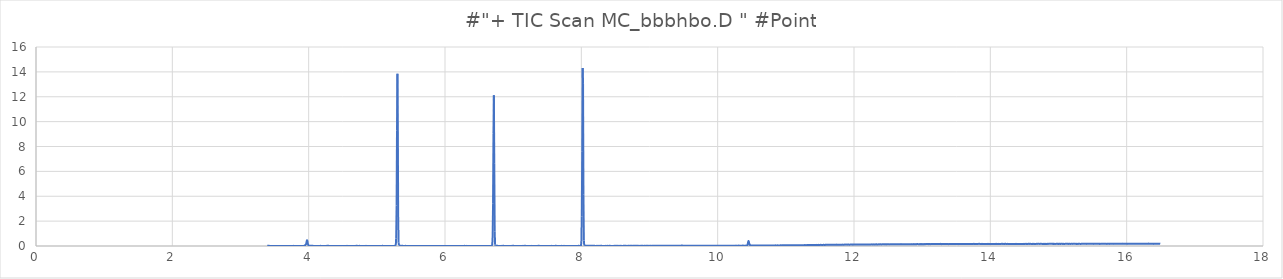
| Category | Series 0 |
|---|---|
| 3.393 | 0.01 |
| 3.399 | 0.013 |
| 3.405 | 0.017 |
| 3.411 | 0.016 |
| 3.417 | 0.013 |
| 3.423 | 0.011 |
| 3.429 | 0.007 |
| 3.435 | 0.007 |
| 3.44 | 0.005 |
| 3.446 | 0.007 |
| 3.452 | 0.005 |
| 3.458 | 0.008 |
| 3.464 | 0.009 |
| 3.47 | 0.007 |
| 3.476 | 0.004 |
| 3.482 | 0.007 |
| 3.488 | 0.006 |
| 3.494 | 0.006 |
| 3.5 | 0.009 |
| 3.506 | 0.006 |
| 3.512 | 0.004 |
| 3.518 | 0.008 |
| 3.524 | 0.006 |
| 3.53 | 0.006 |
| 3.536 | 0.005 |
| 3.542 | 0.007 |
| 3.547 | 0.008 |
| 3.553 | 0.005 |
| 3.559 | 0.005 |
| 3.565 | 0.008 |
| 3.571 | 0.008 |
| 3.577 | 0.007 |
| 3.583 | 0.008 |
| 3.589 | 0.005 |
| 3.595 | 0.003 |
| 3.601 | 0.006 |
| 3.607 | 0.007 |
| 3.613 | 0.004 |
| 3.619 | 0.006 |
| 3.625 | 0.004 |
| 3.631 | 0.007 |
| 3.637 | 0.007 |
| 3.643 | 0.005 |
| 3.649 | 0.003 |
| 3.655 | 0.005 |
| 3.66 | 0.006 |
| 3.666 | 0.01 |
| 3.672 | 0.007 |
| 3.678 | 0.007 |
| 3.684 | 0.005 |
| 3.69 | 0.008 |
| 3.696 | 0.007 |
| 3.702 | 0.007 |
| 3.708 | 0.005 |
| 3.714 | 0.009 |
| 3.72 | 0.004 |
| 3.726 | 0.006 |
| 3.732 | 0.003 |
| 3.738 | 0.006 |
| 3.744 | 0.006 |
| 3.75 | 0.005 |
| 3.756 | 0.004 |
| 3.762 | 0.008 |
| 3.767 | 0.005 |
| 3.773 | 0.007 |
| 3.779 | 0.011 |
| 3.785 | 0.006 |
| 3.791 | 0.008 |
| 3.797 | 0.008 |
| 3.803 | 0.005 |
| 3.809 | 0.004 |
| 3.815 | 0.003 |
| 3.821 | 0.002 |
| 3.827 | 0.003 |
| 3.833 | 0.001 |
| 3.839 | 0.005 |
| 3.845 | 0.005 |
| 3.851 | 0.008 |
| 3.857 | 0.003 |
| 3.863 | 0.006 |
| 3.869 | 0.004 |
| 3.875 | 0.006 |
| 3.88 | 0.007 |
| 3.886 | 0.003 |
| 3.892 | 0.004 |
| 3.898 | 0.004 |
| 3.904 | 0.006 |
| 3.91 | 0.004 |
| 3.916 | 0.003 |
| 3.922 | 0.003 |
| 3.928 | 0.009 |
| 3.934 | 0.012 |
| 3.94 | 0.023 |
| 3.946 | 0.049 |
| 3.952 | 0.09 |
| 3.958 | 0.119 |
| 3.964 | 0.189 |
| 3.97 | 0.36 |
| 3.976 | 0.465 |
| 3.982 | 0.378 |
| 3.987 | 0.197 |
| 3.993 | 0.092 |
| 3.999 | 0.049 |
| 4.005 | 0.027 |
| 4.011 | 0.023 |
| 4.017 | 0.019 |
| 4.023 | 0.017 |
| 4.029 | 0.014 |
| 4.035 | 0.016 |
| 4.041 | 0.019 |
| 4.047 | 0.025 |
| 4.053 | 0.024 |
| 4.059 | 0.019 |
| 4.065 | 0.012 |
| 4.071 | 0.008 |
| 4.077 | 0.008 |
| 4.083 | 0.008 |
| 4.089 | 0.009 |
| 4.095 | 0.007 |
| 4.1 | 0.008 |
| 4.106 | 0.008 |
| 4.112 | 0.008 |
| 4.118 | 0.009 |
| 4.124 | 0.005 |
| 4.13 | 0.009 |
| 4.136 | 0.008 |
| 4.142 | 0.008 |
| 4.148 | 0.008 |
| 4.154 | 0.004 |
| 4.16 | 0.003 |
| 4.166 | 0.01 |
| 4.172 | 0.012 |
| 4.178 | 0.009 |
| 4.184 | 0.007 |
| 4.19 | 0.006 |
| 4.196 | 0.003 |
| 4.202 | 0.002 |
| 4.207 | 0.007 |
| 4.213 | 0.004 |
| 4.219 | 0.003 |
| 4.225 | 0.004 |
| 4.231 | 0.006 |
| 4.237 | 0.004 |
| 4.243 | 0.004 |
| 4.249 | 0.008 |
| 4.255 | 0.008 |
| 4.261 | 0.008 |
| 4.267 | 0.018 |
| 4.273 | 0.027 |
| 4.279 | 0.023 |
| 4.285 | 0.016 |
| 4.291 | 0.014 |
| 4.297 | 0.009 |
| 4.303 | 0.005 |
| 4.309 | 0.006 |
| 4.315 | 0.004 |
| 4.32 | 0.007 |
| 4.326 | 0.005 |
| 4.332 | 0.006 |
| 4.338 | 0.007 |
| 4.344 | 0.005 |
| 4.35 | 0.005 |
| 4.356 | 0.003 |
| 4.362 | 0.007 |
| 4.368 | 0.006 |
| 4.374 | 0.007 |
| 4.38 | 0.004 |
| 4.386 | 0.006 |
| 4.392 | 0.007 |
| 4.398 | 0.005 |
| 4.404 | 0.006 |
| 4.41 | 0.005 |
| 4.416 | 0.006 |
| 4.422 | 0.006 |
| 4.428 | 0.005 |
| 4.433 | 0.005 |
| 4.439 | 0.006 |
| 4.445 | 0.006 |
| 4.451 | 0.003 |
| 4.457 | 0.004 |
| 4.463 | 0.004 |
| 4.469 | 0.008 |
| 4.475 | 0.006 |
| 4.481 | 0.004 |
| 4.487 | 0.006 |
| 4.493 | 0.006 |
| 4.499 | 0.002 |
| 4.505 | 0.007 |
| 4.511 | 0.005 |
| 4.517 | 0.005 |
| 4.523 | 0.005 |
| 4.529 | 0.005 |
| 4.535 | 0.003 |
| 4.54 | 0.008 |
| 4.546 | 0.005 |
| 4.552 | 0.004 |
| 4.558 | 0.009 |
| 4.564 | 0.012 |
| 4.57 | 0.007 |
| 4.576 | 0.008 |
| 4.582 | 0.006 |
| 4.588 | 0.007 |
| 4.594 | 0.004 |
| 4.6 | 0.004 |
| 4.606 | 0.004 |
| 4.612 | 0.007 |
| 4.618 | 0.008 |
| 4.624 | 0.006 |
| 4.63 | 0.007 |
| 4.636 | 0.005 |
| 4.642 | 0.004 |
| 4.648 | 0.002 |
| 4.653 | 0.005 |
| 4.659 | 0.007 |
| 4.665 | 0.004 |
| 4.671 | 0.006 |
| 4.677 | 0.006 |
| 4.683 | 0.008 |
| 4.689 | 0.009 |
| 4.695 | 0.012 |
| 4.701 | 0.017 |
| 4.707 | 0.017 |
| 4.713 | 0.01 |
| 4.719 | 0.007 |
| 4.725 | 0.007 |
| 4.731 | 0.003 |
| 4.737 | 0.006 |
| 4.743 | 0.01 |
| 4.749 | 0.012 |
| 4.755 | 0.005 |
| 4.76 | 0.004 |
| 4.766 | 0.005 |
| 4.772 | 0.006 |
| 4.778 | 0.005 |
| 4.784 | 0.007 |
| 4.79 | 0.003 |
| 4.796 | 0.002 |
| 4.802 | 0.006 |
| 4.808 | 0.004 |
| 4.814 | 0.003 |
| 4.82 | 0.003 |
| 4.826 | 0.006 |
| 4.832 | 0.008 |
| 4.838 | 0.01 |
| 4.844 | 0.01 |
| 4.85 | 0.008 |
| 4.856 | 0.005 |
| 4.862 | 0.003 |
| 4.868 | 0.005 |
| 4.873 | 0.006 |
| 4.879 | 0.004 |
| 4.885 | 0.004 |
| 4.891 | 0.005 |
| 4.897 | 0.003 |
| 4.903 | 0.002 |
| 4.909 | 0.004 |
| 4.915 | 0.004 |
| 4.921 | 0 |
| 4.927 | 0.001 |
| 4.933 | 0.001 |
| 4.939 | 0.005 |
| 4.945 | 0.003 |
| 4.951 | 0.001 |
| 4.957 | 0.003 |
| 4.963 | 0.002 |
| 4.969 | 0.006 |
| 4.975 | 0.003 |
| 4.98 | 0.003 |
| 4.986 | 0.003 |
| 4.992 | 0.001 |
| 4.998 | 0 |
| 5.004 | 0.005 |
| 5.01 | 0.003 |
| 5.016 | 0.003 |
| 5.022 | 0.002 |
| 5.028 | 0.005 |
| 5.034 | 0.003 |
| 5.04 | 0.005 |
| 5.046 | 0.003 |
| 5.052 | 0.005 |
| 5.058 | 0.005 |
| 5.064 | 0.003 |
| 5.07 | 0.008 |
| 5.076 | 0.008 |
| 5.082 | 0.013 |
| 5.088 | 0.011 |
| 5.093 | 0.007 |
| 5.099 | 0.007 |
| 5.105 | 0.007 |
| 5.111 | 0.004 |
| 5.117 | 0.004 |
| 5.123 | 0.003 |
| 5.129 | 0.004 |
| 5.135 | 0.001 |
| 5.141 | 0.004 |
| 5.147 | 0.007 |
| 5.153 | 0.006 |
| 5.159 | 0.007 |
| 5.165 | 0.006 |
| 5.171 | 0.005 |
| 5.177 | 0.002 |
| 5.183 | 0.003 |
| 5.189 | 0.004 |
| 5.195 | 0.003 |
| 5.2 | 0.004 |
| 5.206 | 0.004 |
| 5.212 | 0.001 |
| 5.218 | 0.004 |
| 5.224 | 0.001 |
| 5.23 | 0.002 |
| 5.236 | 0.005 |
| 5.242 | 0.002 |
| 5.248 | 0.002 |
| 5.254 | 0.009 |
| 5.26 | 0.01 |
| 5.266 | 0.015 |
| 5.272 | 0.015 |
| 5.278 | 0.067 |
| 5.284 | 0.626 |
| 5.29 | 3.249 |
| 5.296 | 9.279 |
| 5.302 | 13.857 |
| 5.308 | 9.573 |
| 5.313 | 2.323 |
| 5.319 | 0.265 |
| 5.325 | 0.062 |
| 5.331 | 0.037 |
| 5.337 | 0.029 |
| 5.343 | 0.02 |
| 5.349 | 0.019 |
| 5.355 | 0.018 |
| 5.361 | 0.014 |
| 5.367 | 0.009 |
| 5.373 | 0.013 |
| 5.379 | 0.014 |
| 5.385 | 0.007 |
| 5.391 | 0.009 |
| 5.397 | 0.005 |
| 5.403 | 0.009 |
| 5.409 | 0.008 |
| 5.415 | 0.01 |
| 5.42 | 0.011 |
| 5.426 | 0.008 |
| 5.432 | 0.009 |
| 5.438 | 0.009 |
| 5.444 | 0.008 |
| 5.45 | 0.004 |
| 5.456 | 0.005 |
| 5.462 | 0.008 |
| 5.468 | 0.006 |
| 5.474 | 0.006 |
| 5.48 | 0.004 |
| 5.486 | 0.007 |
| 5.492 | 0.005 |
| 5.498 | 0.006 |
| 5.504 | 0.006 |
| 5.51 | 0.006 |
| 5.516 | 0.003 |
| 5.522 | 0.005 |
| 5.528 | 0.003 |
| 5.533 | 0.003 |
| 5.539 | 0.004 |
| 5.545 | 0.005 |
| 5.551 | 0.005 |
| 5.557 | 0.003 |
| 5.563 | 0.003 |
| 5.569 | 0.005 |
| 5.575 | 0.003 |
| 5.581 | 0.004 |
| 5.587 | 0.003 |
| 5.593 | 0.004 |
| 5.599 | 0.002 |
| 5.605 | 0.005 |
| 5.611 | 0.007 |
| 5.617 | 0.006 |
| 5.623 | 0.003 |
| 5.629 | 0.006 |
| 5.635 | 0.006 |
| 5.64 | 0.004 |
| 5.646 | 0.006 |
| 5.652 | 0.002 |
| 5.658 | 0.004 |
| 5.664 | 0.001 |
| 5.67 | 0.006 |
| 5.676 | 0.003 |
| 5.682 | 0.004 |
| 5.688 | 0.002 |
| 5.694 | 0.004 |
| 5.7 | 0.002 |
| 5.706 | 0.002 |
| 5.712 | 0.004 |
| 5.718 | 0.006 |
| 5.724 | 0.003 |
| 5.73 | 0.003 |
| 5.736 | 0.003 |
| 5.742 | 0.002 |
| 5.748 | 0.001 |
| 5.753 | 0.005 |
| 5.759 | 0.004 |
| 5.765 | 0.005 |
| 5.771 | 0.002 |
| 5.777 | 0.001 |
| 5.783 | 0.003 |
| 5.789 | 0.007 |
| 5.795 | 0.002 |
| 5.801 | 0.006 |
| 5.807 | 0 |
| 5.813 | 0.003 |
| 5.819 | 0.003 |
| 5.825 | 0.002 |
| 5.831 | 0.004 |
| 5.837 | 0.005 |
| 5.843 | 0.004 |
| 5.849 | 0.003 |
| 5.855 | 0.001 |
| 5.86 | 0.003 |
| 5.866 | 0.003 |
| 5.872 | 0.004 |
| 5.878 | 0.005 |
| 5.884 | 0.002 |
| 5.89 | 0.004 |
| 5.896 | 0 |
| 5.902 | 0.004 |
| 5.908 | 0.005 |
| 5.914 | 0.002 |
| 5.92 | 0.005 |
| 5.926 | 0.005 |
| 5.932 | 0.004 |
| 5.938 | 0.004 |
| 5.944 | 0.005 |
| 5.95 | 0.005 |
| 5.956 | 0.002 |
| 5.962 | 0.008 |
| 5.968 | 0.004 |
| 5.973 | 0.006 |
| 5.979 | 0.003 |
| 5.985 | 0.005 |
| 5.991 | 0.005 |
| 5.997 | 0.005 |
| 6.003 | 0.006 |
| 6.009 | 0.006 |
| 6.015 | 0.004 |
| 6.021 | 0.007 |
| 6.027 | 0.006 |
| 6.033 | 0.006 |
| 6.039 | 0.004 |
| 6.045 | 0.005 |
| 6.051 | 0.004 |
| 6.057 | 0.009 |
| 6.063 | 0.008 |
| 6.069 | 0.008 |
| 6.075 | 0.004 |
| 6.08 | 0.003 |
| 6.086 | 0.007 |
| 6.092 | 0.006 |
| 6.098 | 0.005 |
| 6.104 | 0.002 |
| 6.11 | 0.002 |
| 6.116 | 0.002 |
| 6.122 | 0.004 |
| 6.128 | 0.003 |
| 6.134 | 0.003 |
| 6.14 | 0.002 |
| 6.146 | 0.003 |
| 6.152 | 0.003 |
| 6.158 | 0.005 |
| 6.164 | 0.005 |
| 6.17 | 0.005 |
| 6.176 | 0 |
| 6.182 | 0.004 |
| 6.188 | 0.004 |
| 6.193 | 0.005 |
| 6.199 | 0.001 |
| 6.205 | 0.001 |
| 6.211 | 0.003 |
| 6.217 | 0.002 |
| 6.223 | 0.004 |
| 6.229 | 0.005 |
| 6.235 | 0.005 |
| 6.241 | 0.004 |
| 6.247 | 0.006 |
| 6.253 | 0.005 |
| 6.259 | 0.004 |
| 6.265 | 0.004 |
| 6.271 | 0.003 |
| 6.277 | 0.007 |
| 6.283 | 0.011 |
| 6.289 | 0.011 |
| 6.295 | 0.006 |
| 6.3 | 0.003 |
| 6.306 | 0.004 |
| 6.312 | 0.004 |
| 6.318 | 0.01 |
| 6.324 | 0.005 |
| 6.33 | 0.006 |
| 6.336 | 0.002 |
| 6.342 | 0.003 |
| 6.348 | 0.002 |
| 6.354 | 0.007 |
| 6.36 | 0.005 |
| 6.366 | 0.002 |
| 6.372 | 0.002 |
| 6.378 | 0.004 |
| 6.384 | 0.002 |
| 6.39 | 0.002 |
| 6.396 | 0.002 |
| 6.402 | 0.006 |
| 6.408 | 0.003 |
| 6.413 | 0.004 |
| 6.419 | 0.006 |
| 6.425 | 0.004 |
| 6.431 | 0.006 |
| 6.437 | 0.006 |
| 6.443 | 0.005 |
| 6.449 | 0.003 |
| 6.455 | 0.004 |
| 6.461 | 0.003 |
| 6.467 | 0.002 |
| 6.473 | 0.001 |
| 6.479 | 0.004 |
| 6.485 | 0.005 |
| 6.491 | 0.004 |
| 6.497 | 0 |
| 6.503 | 0.002 |
| 6.509 | 0.004 |
| 6.515 | 0.005 |
| 6.52 | 0.001 |
| 6.526 | 0.004 |
| 6.532 | 0.004 |
| 6.538 | 0.005 |
| 6.544 | 0.003 |
| 6.55 | 0.006 |
| 6.556 | 0.004 |
| 6.562 | 0.005 |
| 6.568 | 0.002 |
| 6.574 | 0.005 |
| 6.58 | 0.002 |
| 6.586 | 0.003 |
| 6.592 | 0.003 |
| 6.598 | 0.005 |
| 6.604 | 0.007 |
| 6.61 | 0.004 |
| 6.616 | 0.003 |
| 6.622 | 0.005 |
| 6.628 | 0.008 |
| 6.633 | 0.005 |
| 6.639 | 0.004 |
| 6.645 | 0.004 |
| 6.651 | 0.005 |
| 6.657 | 0.004 |
| 6.663 | 0.005 |
| 6.669 | 0.002 |
| 6.675 | 0.004 |
| 6.681 | 0.005 |
| 6.687 | 0.008 |
| 6.693 | 0.078 |
| 6.699 | 0.721 |
| 6.705 | 3.446 |
| 6.711 | 9.075 |
| 6.717 | 12.122 |
| 6.723 | 6.611 |
| 6.729 | 1.139 |
| 6.735 | 0.112 |
| 6.74 | 0.029 |
| 6.746 | 0.021 |
| 6.752 | 0.017 |
| 6.758 | 0.01 |
| 6.764 | 0.014 |
| 6.77 | 0.012 |
| 6.776 | 0.01 |
| 6.782 | 0.008 |
| 6.788 | 0.008 |
| 6.794 | 0.008 |
| 6.8 | 0.006 |
| 6.806 | 0.005 |
| 6.812 | 0.007 |
| 6.818 | 0.005 |
| 6.824 | 0.006 |
| 6.83 | 0.006 |
| 6.836 | 0.011 |
| 6.842 | 0.007 |
| 6.848 | 0.01 |
| 6.853 | 0.011 |
| 6.859 | 0.012 |
| 6.865 | 0.008 |
| 6.871 | 0.007 |
| 6.877 | 0.004 |
| 6.883 | 0.005 |
| 6.889 | 0.009 |
| 6.895 | 0.007 |
| 6.901 | 0.003 |
| 6.907 | 0.005 |
| 6.913 | 0.006 |
| 6.919 | 0.005 |
| 6.925 | 0.007 |
| 6.931 | 0.007 |
| 6.937 | 0.007 |
| 6.943 | 0.004 |
| 6.949 | 0.001 |
| 6.955 | 0.006 |
| 6.96 | 0.005 |
| 6.966 | 0.005 |
| 6.972 | 0.006 |
| 6.978 | 0.007 |
| 6.984 | 0.011 |
| 6.99 | 0.007 |
| 6.996 | 0.012 |
| 7.002 | 0.014 |
| 7.008 | 0.013 |
| 7.014 | 0.009 |
| 7.02 | 0.007 |
| 7.026 | 0.008 |
| 7.032 | 0.007 |
| 7.038 | 0.006 |
| 7.044 | 0.005 |
| 7.05 | 0.006 |
| 7.056 | 0.005 |
| 7.062 | 0.007 |
| 7.068 | 0.005 |
| 7.073 | 0.006 |
| 7.079 | 0.005 |
| 7.085 | 0.004 |
| 7.091 | 0.007 |
| 7.097 | 0.005 |
| 7.103 | 0.007 |
| 7.109 | 0.007 |
| 7.115 | 0.007 |
| 7.121 | 0.006 |
| 7.127 | 0.005 |
| 7.133 | 0.006 |
| 7.139 | 0.01 |
| 7.145 | 0.007 |
| 7.151 | 0.004 |
| 7.157 | 0.01 |
| 7.163 | 0.009 |
| 7.169 | 0.018 |
| 7.175 | 0.016 |
| 7.18 | 0.012 |
| 7.186 | 0.008 |
| 7.192 | 0.008 |
| 7.198 | 0.007 |
| 7.204 | 0.007 |
| 7.21 | 0.009 |
| 7.216 | 0.008 |
| 7.222 | 0.008 |
| 7.228 | 0.006 |
| 7.234 | 0.007 |
| 7.24 | 0.006 |
| 7.246 | 0.008 |
| 7.252 | 0.007 |
| 7.258 | 0.009 |
| 7.264 | 0.007 |
| 7.27 | 0.007 |
| 7.276 | 0.011 |
| 7.282 | 0.006 |
| 7.288 | 0.003 |
| 7.293 | 0.007 |
| 7.299 | 0.005 |
| 7.305 | 0.002 |
| 7.311 | 0.006 |
| 7.317 | 0.007 |
| 7.323 | 0.006 |
| 7.329 | 0.007 |
| 7.335 | 0.003 |
| 7.341 | 0.006 |
| 7.347 | 0.003 |
| 7.353 | 0.006 |
| 7.359 | 0.006 |
| 7.365 | 0.013 |
| 7.371 | 0.014 |
| 7.377 | 0.014 |
| 7.383 | 0.012 |
| 7.389 | 0.007 |
| 7.395 | 0.008 |
| 7.4 | 0.005 |
| 7.406 | 0.008 |
| 7.412 | 0.008 |
| 7.418 | 0.008 |
| 7.424 | 0.007 |
| 7.43 | 0.008 |
| 7.436 | 0.009 |
| 7.442 | 0.009 |
| 7.448 | 0.01 |
| 7.454 | 0.007 |
| 7.46 | 0.007 |
| 7.466 | 0.007 |
| 7.472 | 0.007 |
| 7.478 | 0.005 |
| 7.484 | 0.007 |
| 7.49 | 0.007 |
| 7.496 | 0.01 |
| 7.502 | 0.008 |
| 7.508 | 0.008 |
| 7.513 | 0.008 |
| 7.519 | 0.008 |
| 7.525 | 0.007 |
| 7.531 | 0.005 |
| 7.537 | 0.006 |
| 7.543 | 0.006 |
| 7.549 | 0.009 |
| 7.555 | 0.008 |
| 7.561 | 0.011 |
| 7.567 | 0.01 |
| 7.573 | 0.008 |
| 7.579 | 0.004 |
| 7.585 | 0.009 |
| 7.591 | 0.006 |
| 7.597 | 0.009 |
| 7.603 | 0.008 |
| 7.609 | 0.008 |
| 7.615 | 0.009 |
| 7.62 | 0.012 |
| 7.626 | 0.018 |
| 7.632 | 0.014 |
| 7.638 | 0.008 |
| 7.644 | 0.007 |
| 7.65 | 0.005 |
| 7.656 | 0.008 |
| 7.662 | 0.007 |
| 7.668 | 0.005 |
| 7.674 | 0.005 |
| 7.68 | 0.007 |
| 7.686 | 0.008 |
| 7.692 | 0.009 |
| 7.698 | 0.009 |
| 7.704 | 0.005 |
| 7.71 | 0.011 |
| 7.716 | 0.005 |
| 7.722 | 0.008 |
| 7.728 | 0.005 |
| 7.733 | 0.006 |
| 7.739 | 0.008 |
| 7.745 | 0.011 |
| 7.751 | 0.008 |
| 7.757 | 0.008 |
| 7.763 | 0.006 |
| 7.769 | 0.009 |
| 7.775 | 0.004 |
| 7.781 | 0.004 |
| 7.787 | 0.006 |
| 7.793 | 0.005 |
| 7.799 | 0.005 |
| 7.805 | 0.008 |
| 7.811 | 0.005 |
| 7.817 | 0.009 |
| 7.823 | 0.005 |
| 7.829 | 0.002 |
| 7.835 | 0.005 |
| 7.84 | 0.007 |
| 7.846 | 0.007 |
| 7.852 | 0.007 |
| 7.858 | 0.007 |
| 7.864 | 0.006 |
| 7.87 | 0.005 |
| 7.876 | 0.006 |
| 7.882 | 0.003 |
| 7.888 | 0.01 |
| 7.894 | 0.008 |
| 7.9 | 0.009 |
| 7.906 | 0.009 |
| 7.912 | 0.008 |
| 7.918 | 0.007 |
| 7.924 | 0.009 |
| 7.93 | 0.008 |
| 7.936 | 0.006 |
| 7.942 | 0.009 |
| 7.948 | 0.009 |
| 7.953 | 0.01 |
| 7.959 | 0.014 |
| 7.965 | 0.011 |
| 7.971 | 0.008 |
| 7.977 | 0.005 |
| 7.983 | 0.008 |
| 7.989 | 0.006 |
| 7.995 | 0.047 |
| 8.001 | 0.391 |
| 8.007 | 2.365 |
| 8.013 | 7.599 |
| 8.019 | 14.319 |
| 8.025 | 13.042 |
| 8.031 | 4.167 |
| 8.037 | 0.439 |
| 8.043 | 0.053 |
| 8.049 | 0.027 |
| 8.055 | 0.025 |
| 8.06 | 0.02 |
| 8.066 | 0.014 |
| 8.072 | 0.016 |
| 8.078 | 0.016 |
| 8.084 | 0.017 |
| 8.09 | 0.012 |
| 8.096 | 0.016 |
| 8.102 | 0.016 |
| 8.108 | 0.014 |
| 8.114 | 0.012 |
| 8.12 | 0.012 |
| 8.126 | 0.013 |
| 8.132 | 0.012 |
| 8.138 | 0.009 |
| 8.144 | 0.015 |
| 8.15 | 0.01 |
| 8.156 | 0.012 |
| 8.162 | 0.011 |
| 8.168 | 0.013 |
| 8.173 | 0.019 |
| 8.179 | 0.015 |
| 8.185 | 0.015 |
| 8.191 | 0.013 |
| 8.197 | 0.012 |
| 8.203 | 0.009 |
| 8.209 | 0.01 |
| 8.215 | 0.009 |
| 8.221 | 0.008 |
| 8.227 | 0.011 |
| 8.233 | 0.01 |
| 8.239 | 0.008 |
| 8.245 | 0.006 |
| 8.251 | 0.009 |
| 8.257 | 0.011 |
| 8.263 | 0.008 |
| 8.269 | 0.011 |
| 8.275 | 0.009 |
| 8.28 | 0.011 |
| 8.286 | 0.013 |
| 8.292 | 0.014 |
| 8.298 | 0.012 |
| 8.304 | 0.009 |
| 8.31 | 0.007 |
| 8.316 | 0.007 |
| 8.322 | 0.006 |
| 8.328 | 0.007 |
| 8.334 | 0.007 |
| 8.34 | 0.009 |
| 8.346 | 0.008 |
| 8.352 | 0.011 |
| 8.358 | 0.007 |
| 8.364 | 0.01 |
| 8.37 | 0.009 |
| 8.376 | 0.012 |
| 8.382 | 0.013 |
| 8.388 | 0.009 |
| 8.393 | 0.009 |
| 8.399 | 0.009 |
| 8.405 | 0.012 |
| 8.411 | 0.013 |
| 8.417 | 0.014 |
| 8.423 | 0.01 |
| 8.429 | 0.01 |
| 8.435 | 0.009 |
| 8.441 | 0.008 |
| 8.447 | 0.009 |
| 8.453 | 0.009 |
| 8.459 | 0.008 |
| 8.465 | 0.008 |
| 8.471 | 0.009 |
| 8.477 | 0.009 |
| 8.483 | 0.013 |
| 8.489 | 0.01 |
| 8.495 | 0.01 |
| 8.5 | 0.012 |
| 8.506 | 0.007 |
| 8.512 | 0.011 |
| 8.518 | 0.007 |
| 8.524 | 0.011 |
| 8.53 | 0.011 |
| 8.536 | 0.007 |
| 8.542 | 0.01 |
| 8.548 | 0.011 |
| 8.554 | 0.008 |
| 8.56 | 0.011 |
| 8.566 | 0.007 |
| 8.572 | 0.013 |
| 8.578 | 0.009 |
| 8.584 | 0.009 |
| 8.59 | 0.01 |
| 8.596 | 0.007 |
| 8.602 | 0.008 |
| 8.608 | 0.008 |
| 8.613 | 0.011 |
| 8.619 | 0.01 |
| 8.625 | 0.014 |
| 8.631 | 0.012 |
| 8.637 | 0.011 |
| 8.643 | 0.012 |
| 8.649 | 0.011 |
| 8.655 | 0.011 |
| 8.661 | 0.007 |
| 8.667 | 0.01 |
| 8.673 | 0.009 |
| 8.679 | 0.01 |
| 8.685 | 0.012 |
| 8.691 | 0.012 |
| 8.697 | 0.011 |
| 8.703 | 0.012 |
| 8.709 | 0.008 |
| 8.715 | 0.012 |
| 8.72 | 0.011 |
| 8.726 | 0.014 |
| 8.732 | 0.01 |
| 8.738 | 0.013 |
| 8.744 | 0.011 |
| 8.75 | 0.009 |
| 8.756 | 0.013 |
| 8.762 | 0.015 |
| 8.768 | 0.011 |
| 8.774 | 0.013 |
| 8.78 | 0.011 |
| 8.786 | 0.013 |
| 8.792 | 0.017 |
| 8.798 | 0.016 |
| 8.804 | 0.016 |
| 8.81 | 0.012 |
| 8.816 | 0.012 |
| 8.822 | 0.012 |
| 8.828 | 0.012 |
| 8.833 | 0.014 |
| 8.839 | 0.01 |
| 8.845 | 0.009 |
| 8.851 | 0.009 |
| 8.857 | 0.011 |
| 8.863 | 0.009 |
| 8.869 | 0.011 |
| 8.875 | 0.013 |
| 8.881 | 0.014 |
| 8.887 | 0.012 |
| 8.893 | 0.017 |
| 8.899 | 0.011 |
| 8.905 | 0.013 |
| 8.911 | 0.009 |
| 8.917 | 0.009 |
| 8.923 | 0.01 |
| 8.929 | 0.012 |
| 8.935 | 0.013 |
| 8.94 | 0.011 |
| 8.946 | 0.009 |
| 8.952 | 0.012 |
| 8.958 | 0.011 |
| 8.964 | 0.01 |
| 8.97 | 0.012 |
| 8.976 | 0.011 |
| 8.982 | 0.009 |
| 8.988 | 0.014 |
| 8.994 | 0.009 |
| 9.0 | 0.012 |
| 9.006 | 0.012 |
| 9.012 | 0.015 |
| 9.018 | 0.015 |
| 9.024 | 0.014 |
| 9.03 | 0.01 |
| 9.036 | 0.011 |
| 9.042 | 0.012 |
| 9.048 | 0.012 |
| 9.053 | 0.012 |
| 9.059 | 0.015 |
| 9.065 | 0.012 |
| 9.071 | 0.012 |
| 9.077 | 0.012 |
| 9.083 | 0.014 |
| 9.089 | 0.013 |
| 9.095 | 0.016 |
| 9.101 | 0.013 |
| 9.107 | 0.013 |
| 9.113 | 0.012 |
| 9.119 | 0.014 |
| 9.125 | 0.01 |
| 9.131 | 0.013 |
| 9.137 | 0.013 |
| 9.143 | 0.012 |
| 9.149 | 0.014 |
| 9.155 | 0.013 |
| 9.16 | 0.012 |
| 9.166 | 0.015 |
| 9.172 | 0.011 |
| 9.178 | 0.013 |
| 9.184 | 0.012 |
| 9.19 | 0.011 |
| 9.196 | 0.015 |
| 9.202 | 0.014 |
| 9.208 | 0.011 |
| 9.214 | 0.015 |
| 9.22 | 0.014 |
| 9.226 | 0.012 |
| 9.232 | 0.015 |
| 9.238 | 0.011 |
| 9.244 | 0.012 |
| 9.25 | 0.01 |
| 9.256 | 0.014 |
| 9.262 | 0.015 |
| 9.268 | 0.013 |
| 9.273 | 0.015 |
| 9.279 | 0.016 |
| 9.285 | 0.016 |
| 9.291 | 0.014 |
| 9.297 | 0.015 |
| 9.303 | 0.013 |
| 9.309 | 0.015 |
| 9.315 | 0.018 |
| 9.321 | 0.015 |
| 9.327 | 0.016 |
| 9.333 | 0.015 |
| 9.339 | 0.016 |
| 9.345 | 0.016 |
| 9.351 | 0.017 |
| 9.357 | 0.014 |
| 9.363 | 0.012 |
| 9.369 | 0.015 |
| 9.375 | 0.012 |
| 9.38 | 0.014 |
| 9.386 | 0.012 |
| 9.392 | 0.011 |
| 9.398 | 0.015 |
| 9.404 | 0.019 |
| 9.41 | 0.012 |
| 9.416 | 0.016 |
| 9.422 | 0.014 |
| 9.428 | 0.018 |
| 9.434 | 0.017 |
| 9.44 | 0.019 |
| 9.446 | 0.016 |
| 9.452 | 0.016 |
| 9.458 | 0.018 |
| 9.464 | 0.027 |
| 9.47 | 0.038 |
| 9.476 | 0.049 |
| 9.482 | 0.038 |
| 9.488 | 0.026 |
| 9.493 | 0.019 |
| 9.499 | 0.017 |
| 9.505 | 0.018 |
| 9.511 | 0.013 |
| 9.517 | 0.015 |
| 9.523 | 0.013 |
| 9.529 | 0.018 |
| 9.535 | 0.017 |
| 9.541 | 0.017 |
| 9.547 | 0.018 |
| 9.553 | 0.016 |
| 9.559 | 0.016 |
| 9.565 | 0.02 |
| 9.571 | 0.019 |
| 9.577 | 0.021 |
| 9.583 | 0.018 |
| 9.589 | 0.015 |
| 9.595 | 0.019 |
| 9.6 | 0.014 |
| 9.606 | 0.015 |
| 9.612 | 0.015 |
| 9.618 | 0.018 |
| 9.624 | 0.016 |
| 9.63 | 0.018 |
| 9.636 | 0.017 |
| 9.642 | 0.02 |
| 9.648 | 0.016 |
| 9.654 | 0.019 |
| 9.66 | 0.018 |
| 9.666 | 0.02 |
| 9.672 | 0.023 |
| 9.678 | 0.018 |
| 9.684 | 0.019 |
| 9.69 | 0.017 |
| 9.696 | 0.016 |
| 9.702 | 0.018 |
| 9.708 | 0.019 |
| 9.713 | 0.018 |
| 9.719 | 0.018 |
| 9.725 | 0.021 |
| 9.731 | 0.016 |
| 9.737 | 0.02 |
| 9.743 | 0.018 |
| 9.749 | 0.016 |
| 9.755 | 0.017 |
| 9.761 | 0.018 |
| 9.767 | 0.02 |
| 9.773 | 0.018 |
| 9.779 | 0.02 |
| 9.785 | 0.024 |
| 9.791 | 0.023 |
| 9.797 | 0.019 |
| 9.803 | 0.021 |
| 9.809 | 0.023 |
| 9.815 | 0.022 |
| 9.82 | 0.02 |
| 9.826 | 0.018 |
| 9.832 | 0.019 |
| 9.838 | 0.022 |
| 9.844 | 0.021 |
| 9.85 | 0.022 |
| 9.856 | 0.02 |
| 9.862 | 0.022 |
| 9.868 | 0.02 |
| 9.874 | 0.018 |
| 9.88 | 0.021 |
| 9.886 | 0.02 |
| 9.892 | 0.018 |
| 9.898 | 0.021 |
| 9.904 | 0.019 |
| 9.91 | 0.021 |
| 9.916 | 0.022 |
| 9.922 | 0.021 |
| 9.928 | 0.019 |
| 9.933 | 0.02 |
| 9.939 | 0.017 |
| 9.945 | 0.021 |
| 9.951 | 0.019 |
| 9.957 | 0.021 |
| 9.963 | 0.023 |
| 9.969 | 0.023 |
| 9.975 | 0.024 |
| 9.981 | 0.021 |
| 9.987 | 0.017 |
| 9.993 | 0.027 |
| 9.999 | 0.023 |
| 10.005 | 0.02 |
| 10.011 | 0.021 |
| 10.017 | 0.023 |
| 10.023 | 0.023 |
| 10.029 | 0.024 |
| 10.035 | 0.021 |
| 10.04 | 0.025 |
| 10.046 | 0.023 |
| 10.052 | 0.023 |
| 10.058 | 0.023 |
| 10.064 | 0.023 |
| 10.07 | 0.025 |
| 10.076 | 0.023 |
| 10.082 | 0.026 |
| 10.088 | 0.026 |
| 10.094 | 0.029 |
| 10.1 | 0.023 |
| 10.106 | 0.023 |
| 10.112 | 0.022 |
| 10.118 | 0.025 |
| 10.124 | 0.022 |
| 10.13 | 0.026 |
| 10.136 | 0.023 |
| 10.142 | 0.021 |
| 10.148 | 0.026 |
| 10.153 | 0.021 |
| 10.159 | 0.025 |
| 10.165 | 0.022 |
| 10.171 | 0.021 |
| 10.177 | 0.024 |
| 10.183 | 0.023 |
| 10.189 | 0.026 |
| 10.195 | 0.023 |
| 10.201 | 0.029 |
| 10.207 | 0.026 |
| 10.213 | 0.025 |
| 10.219 | 0.022 |
| 10.225 | 0.026 |
| 10.231 | 0.027 |
| 10.237 | 0.027 |
| 10.243 | 0.029 |
| 10.249 | 0.029 |
| 10.255 | 0.025 |
| 10.26 | 0.028 |
| 10.266 | 0.03 |
| 10.272 | 0.03 |
| 10.278 | 0.027 |
| 10.284 | 0.027 |
| 10.29 | 0.027 |
| 10.296 | 0.028 |
| 10.302 | 0.03 |
| 10.308 | 0.031 |
| 10.314 | 0.032 |
| 10.32 | 0.027 |
| 10.326 | 0.028 |
| 10.332 | 0.029 |
| 10.338 | 0.029 |
| 10.344 | 0.029 |
| 10.35 | 0.029 |
| 10.356 | 0.028 |
| 10.362 | 0.029 |
| 10.368 | 0.033 |
| 10.373 | 0.033 |
| 10.379 | 0.028 |
| 10.385 | 0.025 |
| 10.391 | 0.027 |
| 10.397 | 0.029 |
| 10.403 | 0.027 |
| 10.409 | 0.031 |
| 10.415 | 0.031 |
| 10.421 | 0.033 |
| 10.427 | 0.03 |
| 10.433 | 0.044 |
| 10.439 | 0.106 |
| 10.445 | 0.259 |
| 10.451 | 0.402 |
| 10.457 | 0.345 |
| 10.463 | 0.2 |
| 10.469 | 0.106 |
| 10.475 | 0.072 |
| 10.48 | 0.06 |
| 10.486 | 0.051 |
| 10.492 | 0.043 |
| 10.498 | 0.04 |
| 10.504 | 0.046 |
| 10.51 | 0.041 |
| 10.516 | 0.044 |
| 10.522 | 0.044 |
| 10.528 | 0.041 |
| 10.534 | 0.041 |
| 10.54 | 0.038 |
| 10.546 | 0.042 |
| 10.552 | 0.041 |
| 10.558 | 0.042 |
| 10.564 | 0.034 |
| 10.57 | 0.043 |
| 10.576 | 0.039 |
| 10.582 | 0.043 |
| 10.588 | 0.039 |
| 10.593 | 0.042 |
| 10.599 | 0.037 |
| 10.605 | 0.037 |
| 10.611 | 0.039 |
| 10.617 | 0.039 |
| 10.623 | 0.038 |
| 10.629 | 0.04 |
| 10.635 | 0.042 |
| 10.641 | 0.039 |
| 10.647 | 0.038 |
| 10.653 | 0.041 |
| 10.659 | 0.039 |
| 10.665 | 0.045 |
| 10.671 | 0.044 |
| 10.677 | 0.038 |
| 10.683 | 0.038 |
| 10.689 | 0.036 |
| 10.695 | 0.041 |
| 10.7 | 0.046 |
| 10.706 | 0.04 |
| 10.712 | 0.044 |
| 10.718 | 0.04 |
| 10.724 | 0.041 |
| 10.73 | 0.042 |
| 10.736 | 0.045 |
| 10.742 | 0.044 |
| 10.748 | 0.043 |
| 10.754 | 0.044 |
| 10.76 | 0.043 |
| 10.766 | 0.044 |
| 10.772 | 0.043 |
| 10.778 | 0.043 |
| 10.784 | 0.042 |
| 10.79 | 0.043 |
| 10.796 | 0.047 |
| 10.802 | 0.048 |
| 10.808 | 0.043 |
| 10.813 | 0.043 |
| 10.819 | 0.049 |
| 10.825 | 0.046 |
| 10.831 | 0.044 |
| 10.837 | 0.043 |
| 10.843 | 0.051 |
| 10.849 | 0.051 |
| 10.855 | 0.045 |
| 10.861 | 0.043 |
| 10.867 | 0.047 |
| 10.873 | 0.046 |
| 10.879 | 0.054 |
| 10.885 | 0.048 |
| 10.891 | 0.048 |
| 10.897 | 0.047 |
| 10.903 | 0.047 |
| 10.909 | 0.049 |
| 10.915 | 0.05 |
| 10.921 | 0.052 |
| 10.926 | 0.052 |
| 10.932 | 0.051 |
| 10.938 | 0.052 |
| 10.944 | 0.047 |
| 10.95 | 0.055 |
| 10.956 | 0.051 |
| 10.962 | 0.054 |
| 10.968 | 0.054 |
| 10.974 | 0.053 |
| 10.98 | 0.051 |
| 10.986 | 0.051 |
| 10.992 | 0.052 |
| 10.998 | 0.052 |
| 11.004 | 0.052 |
| 11.01 | 0.052 |
| 11.016 | 0.056 |
| 11.022 | 0.052 |
| 11.028 | 0.052 |
| 11.033 | 0.055 |
| 11.039 | 0.053 |
| 11.045 | 0.053 |
| 11.051 | 0.054 |
| 11.057 | 0.053 |
| 11.063 | 0.059 |
| 11.069 | 0.056 |
| 11.075 | 0.058 |
| 11.081 | 0.055 |
| 11.087 | 0.06 |
| 11.093 | 0.054 |
| 11.099 | 0.056 |
| 11.105 | 0.058 |
| 11.111 | 0.063 |
| 11.117 | 0.062 |
| 11.123 | 0.063 |
| 11.129 | 0.058 |
| 11.135 | 0.056 |
| 11.141 | 0.059 |
| 11.146 | 0.058 |
| 11.152 | 0.062 |
| 11.158 | 0.06 |
| 11.164 | 0.062 |
| 11.17 | 0.06 |
| 11.176 | 0.064 |
| 11.182 | 0.067 |
| 11.188 | 0.066 |
| 11.194 | 0.065 |
| 11.2 | 0.061 |
| 11.206 | 0.056 |
| 11.212 | 0.062 |
| 11.218 | 0.063 |
| 11.224 | 0.061 |
| 11.23 | 0.06 |
| 11.236 | 0.061 |
| 11.242 | 0.064 |
| 11.248 | 0.07 |
| 11.253 | 0.063 |
| 11.259 | 0.067 |
| 11.265 | 0.069 |
| 11.271 | 0.069 |
| 11.277 | 0.076 |
| 11.283 | 0.069 |
| 11.289 | 0.067 |
| 11.295 | 0.072 |
| 11.301 | 0.07 |
| 11.307 | 0.07 |
| 11.313 | 0.071 |
| 11.319 | 0.072 |
| 11.325 | 0.075 |
| 11.331 | 0.074 |
| 11.337 | 0.073 |
| 11.343 | 0.08 |
| 11.349 | 0.07 |
| 11.355 | 0.071 |
| 11.361 | 0.074 |
| 11.366 | 0.08 |
| 11.372 | 0.078 |
| 11.378 | 0.074 |
| 11.384 | 0.082 |
| 11.39 | 0.075 |
| 11.396 | 0.071 |
| 11.402 | 0.078 |
| 11.408 | 0.072 |
| 11.414 | 0.079 |
| 11.42 | 0.077 |
| 11.426 | 0.086 |
| 11.432 | 0.08 |
| 11.438 | 0.083 |
| 11.444 | 0.077 |
| 11.45 | 0.085 |
| 11.456 | 0.092 |
| 11.462 | 0.079 |
| 11.468 | 0.084 |
| 11.473 | 0.084 |
| 11.479 | 0.093 |
| 11.485 | 0.086 |
| 11.491 | 0.087 |
| 11.497 | 0.086 |
| 11.503 | 0.087 |
| 11.509 | 0.093 |
| 11.515 | 0.091 |
| 11.521 | 0.09 |
| 11.527 | 0.089 |
| 11.533 | 0.083 |
| 11.539 | 0.084 |
| 11.545 | 0.09 |
| 11.551 | 0.092 |
| 11.557 | 0.092 |
| 11.563 | 0.087 |
| 11.569 | 0.091 |
| 11.575 | 0.085 |
| 11.581 | 0.095 |
| 11.586 | 0.099 |
| 11.592 | 0.097 |
| 11.598 | 0.096 |
| 11.604 | 0.093 |
| 11.61 | 0.091 |
| 11.616 | 0.098 |
| 11.622 | 0.093 |
| 11.628 | 0.1 |
| 11.634 | 0.101 |
| 11.64 | 0.101 |
| 11.646 | 0.1 |
| 11.652 | 0.1 |
| 11.658 | 0.099 |
| 11.664 | 0.097 |
| 11.67 | 0.097 |
| 11.676 | 0.096 |
| 11.682 | 0.101 |
| 11.688 | 0.101 |
| 11.693 | 0.098 |
| 11.699 | 0.102 |
| 11.705 | 0.108 |
| 11.711 | 0.1 |
| 11.717 | 0.1 |
| 11.723 | 0.102 |
| 11.729 | 0.104 |
| 11.735 | 0.107 |
| 11.741 | 0.111 |
| 11.747 | 0.1 |
| 11.753 | 0.108 |
| 11.759 | 0.107 |
| 11.765 | 0.104 |
| 11.771 | 0.11 |
| 11.777 | 0.103 |
| 11.783 | 0.108 |
| 11.789 | 0.106 |
| 11.795 | 0.109 |
| 11.801 | 0.106 |
| 11.806 | 0.107 |
| 11.812 | 0.107 |
| 11.818 | 0.108 |
| 11.824 | 0.11 |
| 11.83 | 0.112 |
| 11.836 | 0.103 |
| 11.842 | 0.107 |
| 11.848 | 0.108 |
| 11.854 | 0.109 |
| 11.86 | 0.116 |
| 11.866 | 0.108 |
| 11.872 | 0.115 |
| 11.878 | 0.11 |
| 11.884 | 0.108 |
| 11.89 | 0.113 |
| 11.896 | 0.112 |
| 11.902 | 0.113 |
| 11.908 | 0.11 |
| 11.913 | 0.108 |
| 11.919 | 0.12 |
| 11.925 | 0.114 |
| 11.931 | 0.106 |
| 11.937 | 0.107 |
| 11.943 | 0.111 |
| 11.949 | 0.111 |
| 11.955 | 0.111 |
| 11.961 | 0.117 |
| 11.967 | 0.112 |
| 11.973 | 0.112 |
| 11.979 | 0.11 |
| 11.985 | 0.116 |
| 11.991 | 0.108 |
| 11.997 | 0.116 |
| 12.003 | 0.114 |
| 12.009 | 0.115 |
| 12.015 | 0.117 |
| 12.021 | 0.119 |
| 12.026 | 0.12 |
| 12.032 | 0.113 |
| 12.038 | 0.117 |
| 12.044 | 0.118 |
| 12.05 | 0.113 |
| 12.056 | 0.117 |
| 12.062 | 0.113 |
| 12.068 | 0.115 |
| 12.074 | 0.12 |
| 12.08 | 0.116 |
| 12.086 | 0.115 |
| 12.092 | 0.12 |
| 12.098 | 0.121 |
| 12.104 | 0.12 |
| 12.11 | 0.125 |
| 12.116 | 0.128 |
| 12.122 | 0.123 |
| 12.128 | 0.118 |
| 12.133 | 0.123 |
| 12.139 | 0.116 |
| 12.145 | 0.117 |
| 12.151 | 0.124 |
| 12.157 | 0.126 |
| 12.163 | 0.118 |
| 12.169 | 0.121 |
| 12.175 | 0.124 |
| 12.181 | 0.117 |
| 12.187 | 0.128 |
| 12.193 | 0.126 |
| 12.199 | 0.123 |
| 12.205 | 0.128 |
| 12.211 | 0.122 |
| 12.217 | 0.123 |
| 12.223 | 0.116 |
| 12.229 | 0.123 |
| 12.235 | 0.126 |
| 12.241 | 0.126 |
| 12.246 | 0.129 |
| 12.252 | 0.131 |
| 12.258 | 0.13 |
| 12.264 | 0.122 |
| 12.27 | 0.123 |
| 12.276 | 0.131 |
| 12.282 | 0.126 |
| 12.288 | 0.131 |
| 12.294 | 0.13 |
| 12.3 | 0.123 |
| 12.306 | 0.129 |
| 12.312 | 0.133 |
| 12.318 | 0.122 |
| 12.324 | 0.129 |
| 12.33 | 0.14 |
| 12.336 | 0.123 |
| 12.342 | 0.127 |
| 12.348 | 0.129 |
| 12.353 | 0.118 |
| 12.359 | 0.132 |
| 12.365 | 0.132 |
| 12.371 | 0.13 |
| 12.377 | 0.132 |
| 12.383 | 0.133 |
| 12.389 | 0.13 |
| 12.395 | 0.136 |
| 12.401 | 0.125 |
| 12.407 | 0.13 |
| 12.413 | 0.136 |
| 12.419 | 0.132 |
| 12.425 | 0.134 |
| 12.431 | 0.134 |
| 12.437 | 0.138 |
| 12.443 | 0.131 |
| 12.449 | 0.135 |
| 12.455 | 0.129 |
| 12.461 | 0.138 |
| 12.466 | 0.135 |
| 12.472 | 0.137 |
| 12.478 | 0.129 |
| 12.484 | 0.138 |
| 12.49 | 0.136 |
| 12.496 | 0.134 |
| 12.502 | 0.134 |
| 12.508 | 0.138 |
| 12.514 | 0.14 |
| 12.52 | 0.133 |
| 12.526 | 0.13 |
| 12.532 | 0.133 |
| 12.538 | 0.131 |
| 12.544 | 0.142 |
| 12.55 | 0.131 |
| 12.556 | 0.134 |
| 12.562 | 0.137 |
| 12.568 | 0.139 |
| 12.573 | 0.134 |
| 12.579 | 0.137 |
| 12.585 | 0.141 |
| 12.591 | 0.131 |
| 12.597 | 0.141 |
| 12.603 | 0.135 |
| 12.609 | 0.133 |
| 12.615 | 0.138 |
| 12.621 | 0.137 |
| 12.627 | 0.133 |
| 12.633 | 0.144 |
| 12.639 | 0.142 |
| 12.645 | 0.13 |
| 12.651 | 0.144 |
| 12.657 | 0.15 |
| 12.663 | 0.135 |
| 12.669 | 0.142 |
| 12.675 | 0.141 |
| 12.681 | 0.136 |
| 12.686 | 0.149 |
| 12.692 | 0.15 |
| 12.698 | 0.135 |
| 12.704 | 0.147 |
| 12.71 | 0.134 |
| 12.716 | 0.144 |
| 12.722 | 0.144 |
| 12.728 | 0.141 |
| 12.734 | 0.149 |
| 12.74 | 0.147 |
| 12.746 | 0.138 |
| 12.752 | 0.141 |
| 12.758 | 0.142 |
| 12.764 | 0.143 |
| 12.77 | 0.148 |
| 12.776 | 0.141 |
| 12.782 | 0.142 |
| 12.788 | 0.147 |
| 12.793 | 0.14 |
| 12.799 | 0.144 |
| 12.805 | 0.146 |
| 12.811 | 0.14 |
| 12.817 | 0.147 |
| 12.823 | 0.146 |
| 12.829 | 0.145 |
| 12.835 | 0.141 |
| 12.841 | 0.153 |
| 12.847 | 0.141 |
| 12.853 | 0.145 |
| 12.859 | 0.149 |
| 12.865 | 0.147 |
| 12.871 | 0.146 |
| 12.877 | 0.154 |
| 12.883 | 0.146 |
| 12.889 | 0.148 |
| 12.895 | 0.152 |
| 12.901 | 0.148 |
| 12.906 | 0.147 |
| 12.912 | 0.148 |
| 12.918 | 0.141 |
| 12.924 | 0.157 |
| 12.93 | 0.153 |
| 12.936 | 0.151 |
| 12.942 | 0.149 |
| 12.948 | 0.14 |
| 12.954 | 0.151 |
| 12.96 | 0.144 |
| 12.966 | 0.153 |
| 12.972 | 0.141 |
| 12.978 | 0.159 |
| 12.984 | 0.147 |
| 12.99 | 0.154 |
| 12.996 | 0.14 |
| 13.002 | 0.151 |
| 13.008 | 0.148 |
| 13.013 | 0.155 |
| 13.019 | 0.144 |
| 13.025 | 0.147 |
| 13.031 | 0.149 |
| 13.037 | 0.156 |
| 13.043 | 0.147 |
| 13.049 | 0.153 |
| 13.055 | 0.152 |
| 13.061 | 0.151 |
| 13.067 | 0.152 |
| 13.073 | 0.155 |
| 13.079 | 0.155 |
| 13.085 | 0.161 |
| 13.091 | 0.148 |
| 13.097 | 0.152 |
| 13.103 | 0.154 |
| 13.109 | 0.156 |
| 13.115 | 0.149 |
| 13.121 | 0.151 |
| 13.126 | 0.163 |
| 13.132 | 0.154 |
| 13.138 | 0.151 |
| 13.144 | 0.154 |
| 13.15 | 0.152 |
| 13.156 | 0.151 |
| 13.162 | 0.158 |
| 13.168 | 0.156 |
| 13.174 | 0.161 |
| 13.18 | 0.159 |
| 13.186 | 0.154 |
| 13.192 | 0.157 |
| 13.198 | 0.154 |
| 13.204 | 0.16 |
| 13.21 | 0.152 |
| 13.216 | 0.164 |
| 13.222 | 0.164 |
| 13.228 | 0.155 |
| 13.233 | 0.157 |
| 13.239 | 0.151 |
| 13.245 | 0.16 |
| 13.251 | 0.155 |
| 13.257 | 0.163 |
| 13.263 | 0.163 |
| 13.269 | 0.172 |
| 13.275 | 0.156 |
| 13.281 | 0.158 |
| 13.287 | 0.148 |
| 13.293 | 0.165 |
| 13.299 | 0.161 |
| 13.305 | 0.155 |
| 13.311 | 0.163 |
| 13.317 | 0.161 |
| 13.323 | 0.154 |
| 13.329 | 0.159 |
| 13.335 | 0.162 |
| 13.341 | 0.157 |
| 13.346 | 0.154 |
| 13.352 | 0.153 |
| 13.358 | 0.16 |
| 13.364 | 0.163 |
| 13.37 | 0.16 |
| 13.376 | 0.155 |
| 13.382 | 0.159 |
| 13.388 | 0.15 |
| 13.394 | 0.151 |
| 13.4 | 0.159 |
| 13.406 | 0.156 |
| 13.412 | 0.154 |
| 13.418 | 0.161 |
| 13.424 | 0.168 |
| 13.43 | 0.158 |
| 13.436 | 0.157 |
| 13.442 | 0.16 |
| 13.448 | 0.16 |
| 13.453 | 0.164 |
| 13.459 | 0.155 |
| 13.465 | 0.163 |
| 13.471 | 0.152 |
| 13.477 | 0.156 |
| 13.483 | 0.16 |
| 13.489 | 0.152 |
| 13.495 | 0.161 |
| 13.501 | 0.161 |
| 13.507 | 0.151 |
| 13.513 | 0.167 |
| 13.519 | 0.151 |
| 13.525 | 0.156 |
| 13.531 | 0.15 |
| 13.537 | 0.163 |
| 13.543 | 0.158 |
| 13.549 | 0.164 |
| 13.555 | 0.158 |
| 13.561 | 0.157 |
| 13.566 | 0.154 |
| 13.572 | 0.157 |
| 13.578 | 0.153 |
| 13.584 | 0.158 |
| 13.59 | 0.161 |
| 13.596 | 0.164 |
| 13.602 | 0.162 |
| 13.608 | 0.163 |
| 13.614 | 0.158 |
| 13.62 | 0.171 |
| 13.626 | 0.159 |
| 13.632 | 0.164 |
| 13.638 | 0.167 |
| 13.644 | 0.156 |
| 13.65 | 0.162 |
| 13.656 | 0.162 |
| 13.662 | 0.165 |
| 13.668 | 0.152 |
| 13.673 | 0.166 |
| 13.679 | 0.152 |
| 13.685 | 0.162 |
| 13.691 | 0.152 |
| 13.697 | 0.159 |
| 13.703 | 0.159 |
| 13.709 | 0.16 |
| 13.715 | 0.164 |
| 13.721 | 0.16 |
| 13.727 | 0.166 |
| 13.733 | 0.158 |
| 13.739 | 0.169 |
| 13.745 | 0.161 |
| 13.751 | 0.16 |
| 13.757 | 0.176 |
| 13.763 | 0.17 |
| 13.769 | 0.167 |
| 13.775 | 0.166 |
| 13.781 | 0.167 |
| 13.786 | 0.16 |
| 13.792 | 0.165 |
| 13.798 | 0.168 |
| 13.804 | 0.16 |
| 13.81 | 0.164 |
| 13.816 | 0.164 |
| 13.822 | 0.169 |
| 13.828 | 0.171 |
| 13.834 | 0.174 |
| 13.84 | 0.171 |
| 13.846 | 0.169 |
| 13.852 | 0.156 |
| 13.858 | 0.16 |
| 13.864 | 0.165 |
| 13.87 | 0.172 |
| 13.876 | 0.163 |
| 13.882 | 0.172 |
| 13.888 | 0.162 |
| 13.893 | 0.164 |
| 13.899 | 0.157 |
| 13.905 | 0.156 |
| 13.911 | 0.165 |
| 13.917 | 0.158 |
| 13.923 | 0.165 |
| 13.929 | 0.164 |
| 13.935 | 0.159 |
| 13.941 | 0.163 |
| 13.947 | 0.17 |
| 13.953 | 0.155 |
| 13.959 | 0.157 |
| 13.965 | 0.172 |
| 13.971 | 0.167 |
| 13.977 | 0.157 |
| 13.983 | 0.167 |
| 13.989 | 0.167 |
| 13.995 | 0.168 |
| 14.001 | 0.167 |
| 14.006 | 0.162 |
| 14.012 | 0.154 |
| 14.018 | 0.163 |
| 14.024 | 0.164 |
| 14.03 | 0.161 |
| 14.036 | 0.155 |
| 14.042 | 0.157 |
| 14.048 | 0.161 |
| 14.054 | 0.161 |
| 14.06 | 0.167 |
| 14.066 | 0.161 |
| 14.072 | 0.163 |
| 14.078 | 0.161 |
| 14.084 | 0.175 |
| 14.09 | 0.164 |
| 14.096 | 0.163 |
| 14.102 | 0.161 |
| 14.108 | 0.159 |
| 14.113 | 0.172 |
| 14.119 | 0.168 |
| 14.125 | 0.167 |
| 14.131 | 0.169 |
| 14.137 | 0.16 |
| 14.143 | 0.169 |
| 14.149 | 0.159 |
| 14.155 | 0.16 |
| 14.161 | 0.167 |
| 14.167 | 0.175 |
| 14.173 | 0.169 |
| 14.179 | 0.174 |
| 14.185 | 0.167 |
| 14.191 | 0.172 |
| 14.197 | 0.169 |
| 14.203 | 0.166 |
| 14.209 | 0.162 |
| 14.215 | 0.177 |
| 14.221 | 0.171 |
| 14.226 | 0.173 |
| 14.232 | 0.167 |
| 14.238 | 0.168 |
| 14.244 | 0.171 |
| 14.25 | 0.171 |
| 14.256 | 0.16 |
| 14.262 | 0.17 |
| 14.268 | 0.171 |
| 14.274 | 0.169 |
| 14.28 | 0.17 |
| 14.286 | 0.162 |
| 14.292 | 0.168 |
| 14.298 | 0.168 |
| 14.304 | 0.161 |
| 14.31 | 0.16 |
| 14.316 | 0.163 |
| 14.322 | 0.169 |
| 14.328 | 0.166 |
| 14.333 | 0.164 |
| 14.339 | 0.17 |
| 14.345 | 0.164 |
| 14.351 | 0.158 |
| 14.357 | 0.162 |
| 14.363 | 0.166 |
| 14.369 | 0.162 |
| 14.375 | 0.173 |
| 14.381 | 0.168 |
| 14.387 | 0.167 |
| 14.393 | 0.162 |
| 14.399 | 0.166 |
| 14.405 | 0.165 |
| 14.411 | 0.165 |
| 14.417 | 0.163 |
| 14.423 | 0.164 |
| 14.429 | 0.163 |
| 14.435 | 0.165 |
| 14.441 | 0.163 |
| 14.446 | 0.161 |
| 14.452 | 0.168 |
| 14.458 | 0.163 |
| 14.464 | 0.169 |
| 14.47 | 0.166 |
| 14.476 | 0.161 |
| 14.482 | 0.167 |
| 14.488 | 0.159 |
| 14.494 | 0.172 |
| 14.5 | 0.162 |
| 14.506 | 0.169 |
| 14.512 | 0.173 |
| 14.518 | 0.168 |
| 14.524 | 0.161 |
| 14.53 | 0.172 |
| 14.536 | 0.162 |
| 14.542 | 0.17 |
| 14.548 | 0.157 |
| 14.553 | 0.177 |
| 14.559 | 0.175 |
| 14.565 | 0.171 |
| 14.571 | 0.163 |
| 14.577 | 0.176 |
| 14.583 | 0.172 |
| 14.589 | 0.174 |
| 14.595 | 0.161 |
| 14.601 | 0.165 |
| 14.607 | 0.168 |
| 14.613 | 0.165 |
| 14.619 | 0.172 |
| 14.625 | 0.167 |
| 14.631 | 0.171 |
| 14.637 | 0.171 |
| 14.643 | 0.163 |
| 14.649 | 0.172 |
| 14.655 | 0.165 |
| 14.661 | 0.167 |
| 14.666 | 0.167 |
| 14.672 | 0.172 |
| 14.678 | 0.172 |
| 14.684 | 0.168 |
| 14.69 | 0.174 |
| 14.696 | 0.17 |
| 14.702 | 0.172 |
| 14.708 | 0.179 |
| 14.714 | 0.173 |
| 14.72 | 0.17 |
| 14.726 | 0.162 |
| 14.732 | 0.172 |
| 14.738 | 0.172 |
| 14.744 | 0.172 |
| 14.75 | 0.174 |
| 14.756 | 0.169 |
| 14.762 | 0.159 |
| 14.768 | 0.17 |
| 14.773 | 0.17 |
| 14.779 | 0.167 |
| 14.785 | 0.176 |
| 14.791 | 0.162 |
| 14.797 | 0.16 |
| 14.803 | 0.173 |
| 14.809 | 0.166 |
| 14.815 | 0.171 |
| 14.821 | 0.168 |
| 14.827 | 0.167 |
| 14.833 | 0.175 |
| 14.839 | 0.166 |
| 14.845 | 0.172 |
| 14.851 | 0.174 |
| 14.857 | 0.17 |
| 14.863 | 0.171 |
| 14.869 | 0.172 |
| 14.875 | 0.177 |
| 14.881 | 0.172 |
| 14.886 | 0.176 |
| 14.892 | 0.173 |
| 14.898 | 0.173 |
| 14.904 | 0.173 |
| 14.91 | 0.17 |
| 14.916 | 0.18 |
| 14.922 | 0.165 |
| 14.928 | 0.175 |
| 14.934 | 0.163 |
| 14.94 | 0.173 |
| 14.946 | 0.17 |
| 14.952 | 0.171 |
| 14.958 | 0.168 |
| 14.964 | 0.172 |
| 14.97 | 0.177 |
| 14.976 | 0.169 |
| 14.982 | 0.175 |
| 14.988 | 0.179 |
| 14.993 | 0.164 |
| 14.999 | 0.176 |
| 15.005 | 0.167 |
| 15.011 | 0.174 |
| 15.017 | 0.17 |
| 15.023 | 0.171 |
| 15.029 | 0.164 |
| 15.035 | 0.175 |
| 15.041 | 0.18 |
| 15.047 | 0.176 |
| 15.053 | 0.17 |
| 15.059 | 0.17 |
| 15.065 | 0.173 |
| 15.071 | 0.178 |
| 15.077 | 0.164 |
| 15.083 | 0.168 |
| 15.089 | 0.166 |
| 15.095 | 0.172 |
| 15.101 | 0.172 |
| 15.106 | 0.172 |
| 15.112 | 0.176 |
| 15.118 | 0.178 |
| 15.124 | 0.172 |
| 15.13 | 0.181 |
| 15.136 | 0.178 |
| 15.142 | 0.163 |
| 15.148 | 0.168 |
| 15.154 | 0.176 |
| 15.16 | 0.176 |
| 15.166 | 0.172 |
| 15.172 | 0.164 |
| 15.178 | 0.168 |
| 15.184 | 0.181 |
| 15.19 | 0.176 |
| 15.196 | 0.173 |
| 15.202 | 0.179 |
| 15.208 | 0.169 |
| 15.213 | 0.171 |
| 15.219 | 0.178 |
| 15.225 | 0.177 |
| 15.231 | 0.172 |
| 15.237 | 0.172 |
| 15.243 | 0.179 |
| 15.249 | 0.175 |
| 15.255 | 0.169 |
| 15.261 | 0.162 |
| 15.267 | 0.176 |
| 15.273 | 0.166 |
| 15.279 | 0.166 |
| 15.285 | 0.176 |
| 15.291 | 0.174 |
| 15.297 | 0.169 |
| 15.303 | 0.178 |
| 15.309 | 0.177 |
| 15.315 | 0.173 |
| 15.321 | 0.167 |
| 15.326 | 0.166 |
| 15.332 | 0.171 |
| 15.338 | 0.175 |
| 15.344 | 0.176 |
| 15.35 | 0.178 |
| 15.356 | 0.173 |
| 15.362 | 0.174 |
| 15.368 | 0.179 |
| 15.374 | 0.176 |
| 15.38 | 0.176 |
| 15.386 | 0.182 |
| 15.392 | 0.177 |
| 15.398 | 0.177 |
| 15.404 | 0.175 |
| 15.41 | 0.169 |
| 15.416 | 0.173 |
| 15.422 | 0.175 |
| 15.428 | 0.183 |
| 15.433 | 0.176 |
| 15.439 | 0.174 |
| 15.445 | 0.173 |
| 15.451 | 0.176 |
| 15.457 | 0.176 |
| 15.463 | 0.18 |
| 15.469 | 0.175 |
| 15.475 | 0.182 |
| 15.481 | 0.178 |
| 15.487 | 0.181 |
| 15.493 | 0.176 |
| 15.499 | 0.173 |
| 15.505 | 0.174 |
| 15.511 | 0.182 |
| 15.517 | 0.167 |
| 15.523 | 0.18 |
| 15.529 | 0.172 |
| 15.535 | 0.176 |
| 15.541 | 0.179 |
| 15.546 | 0.175 |
| 15.552 | 0.18 |
| 15.558 | 0.177 |
| 15.564 | 0.172 |
| 15.57 | 0.175 |
| 15.576 | 0.17 |
| 15.582 | 0.18 |
| 15.588 | 0.171 |
| 15.594 | 0.172 |
| 15.6 | 0.167 |
| 15.606 | 0.182 |
| 15.612 | 0.175 |
| 15.618 | 0.169 |
| 15.624 | 0.175 |
| 15.63 | 0.175 |
| 15.636 | 0.175 |
| 15.642 | 0.179 |
| 15.648 | 0.187 |
| 15.653 | 0.171 |
| 15.659 | 0.182 |
| 15.665 | 0.178 |
| 15.671 | 0.174 |
| 15.677 | 0.177 |
| 15.683 | 0.171 |
| 15.689 | 0.175 |
| 15.695 | 0.173 |
| 15.701 | 0.169 |
| 15.707 | 0.181 |
| 15.713 | 0.172 |
| 15.719 | 0.183 |
| 15.725 | 0.168 |
| 15.731 | 0.184 |
| 15.737 | 0.179 |
| 15.743 | 0.168 |
| 15.749 | 0.179 |
| 15.755 | 0.171 |
| 15.761 | 0.172 |
| 15.766 | 0.173 |
| 15.772 | 0.184 |
| 15.778 | 0.174 |
| 15.784 | 0.173 |
| 15.79 | 0.176 |
| 15.796 | 0.175 |
| 15.802 | 0.169 |
| 15.808 | 0.184 |
| 15.814 | 0.174 |
| 15.82 | 0.171 |
| 15.826 | 0.182 |
| 15.832 | 0.175 |
| 15.838 | 0.181 |
| 15.844 | 0.171 |
| 15.85 | 0.176 |
| 15.856 | 0.177 |
| 15.862 | 0.18 |
| 15.868 | 0.177 |
| 15.873 | 0.178 |
| 15.879 | 0.18 |
| 15.885 | 0.179 |
| 15.891 | 0.173 |
| 15.897 | 0.178 |
| 15.903 | 0.174 |
| 15.909 | 0.179 |
| 15.915 | 0.179 |
| 15.921 | 0.179 |
| 15.927 | 0.182 |
| 15.933 | 0.192 |
| 15.939 | 0.178 |
| 15.945 | 0.179 |
| 15.951 | 0.183 |
| 15.957 | 0.173 |
| 15.963 | 0.182 |
| 15.969 | 0.181 |
| 15.975 | 0.173 |
| 15.981 | 0.186 |
| 15.986 | 0.184 |
| 15.992 | 0.185 |
| 15.998 | 0.177 |
| 16.004 | 0.177 |
| 16.01 | 0.17 |
| 16.016 | 0.175 |
| 16.022 | 0.178 |
| 16.028 | 0.172 |
| 16.034 | 0.177 |
| 16.04 | 0.175 |
| 16.046 | 0.177 |
| 16.052 | 0.17 |
| 16.058 | 0.174 |
| 16.064 | 0.172 |
| 16.07 | 0.178 |
| 16.076 | 0.174 |
| 16.082 | 0.182 |
| 16.088 | 0.182 |
| 16.093 | 0.184 |
| 16.099 | 0.18 |
| 16.105 | 0.184 |
| 16.111 | 0.185 |
| 16.117 | 0.182 |
| 16.123 | 0.178 |
| 16.129 | 0.187 |
| 16.135 | 0.182 |
| 16.141 | 0.188 |
| 16.147 | 0.181 |
| 16.153 | 0.177 |
| 16.159 | 0.19 |
| 16.165 | 0.171 |
| 16.171 | 0.177 |
| 16.177 | 0.183 |
| 16.183 | 0.175 |
| 16.189 | 0.179 |
| 16.195 | 0.177 |
| 16.201 | 0.172 |
| 16.206 | 0.178 |
| 16.212 | 0.181 |
| 16.218 | 0.178 |
| 16.224 | 0.178 |
| 16.23 | 0.184 |
| 16.236 | 0.172 |
| 16.242 | 0.179 |
| 16.248 | 0.184 |
| 16.254 | 0.18 |
| 16.26 | 0.177 |
| 16.266 | 0.179 |
| 16.272 | 0.186 |
| 16.278 | 0.172 |
| 16.284 | 0.175 |
| 16.29 | 0.185 |
| 16.296 | 0.183 |
| 16.302 | 0.18 |
| 16.308 | 0.186 |
| 16.313 | 0.18 |
| 16.319 | 0.195 |
| 16.325 | 0.183 |
| 16.331 | 0.177 |
| 16.337 | 0.176 |
| 16.343 | 0.178 |
| 16.349 | 0.177 |
| 16.355 | 0.178 |
| 16.361 | 0.171 |
| 16.367 | 0.182 |
| 16.373 | 0.182 |
| 16.379 | 0.179 |
| 16.385 | 0.18 |
| 16.391 | 0.179 |
| 16.397 | 0.169 |
| 16.403 | 0.179 |
| 16.409 | 0.171 |
| 16.415 | 0.179 |
| 16.421 | 0.183 |
| 16.426 | 0.17 |
| 16.432 | 0.184 |
| 16.438 | 0.18 |
| 16.444 | 0.177 |
| 16.45 | 0.172 |
| 16.456 | 0.175 |
| 16.462 | 0.184 |
| 16.468 | 0.181 |
| 16.474 | 0.173 |
| 16.48 | 0.183 |
| 16.486 | 0.181 |
| 16.492 | 0.173 |